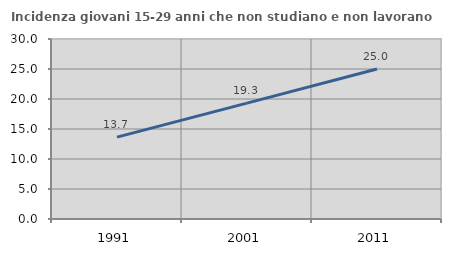
| Category | Incidenza giovani 15-29 anni che non studiano e non lavorano  |
|---|---|
| 1991.0 | 13.652 |
| 2001.0 | 19.318 |
| 2011.0 | 25 |